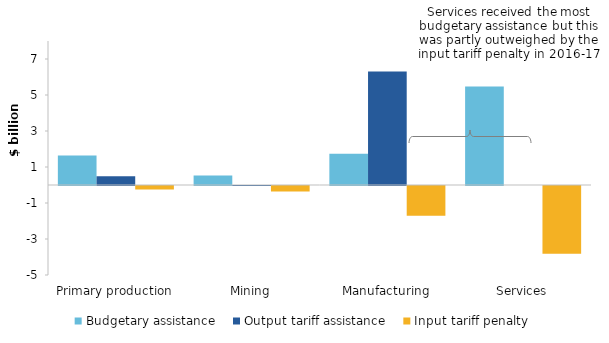
| Category | Budgetary assistance | Output tariff assistance | Input tariff penalty |
|---|---|---|---|
| Primary production | 1.64 | 0.488 | -0.198 |
| Mining | 0.522 | 0.002 | -0.309 |
| Manufacturing | 1.73 | 6.299 | -1.65 |
| Services | 5.478 | 0 | -3.768 |